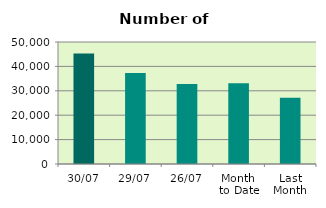
| Category | Series 0 |
|---|---|
| 30/07 | 45264 |
| 29/07 | 37318 |
| 26/07 | 32742 |
| Month 
to Date | 33107.636 |
| Last
Month | 27125.1 |